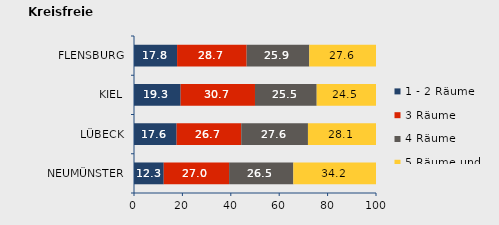
| Category | 1 - 2 Räume | 3 Räume | 4 Räume | 5 Räume und mehr |
|---|---|---|---|---|
| NEUMÜNSTER | 12.288 | 27.013 | 26.537 | 34.162 |
| LÜBECK | 17.612 | 26.699 | 27.57 | 28.119 |
| KIEL | 19.273 | 30.723 | 25.498 | 24.506 |
| FLENSBURG | 17.803 | 28.747 | 25.873 | 27.578 |